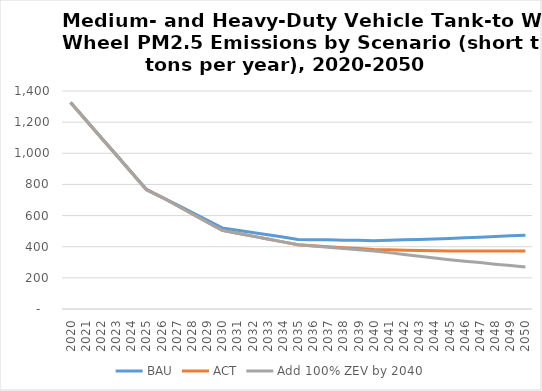
| Category | BAU | ACT | Add 100% ZEV by 2040 |
|---|---|---|---|
| 2020.0 | 1326 | 1326 | 1326.052 |
| 2021.0 | 1215 | 1214 | 1214 |
| 2022.0 | 1103 | 1102 | 1102 |
| 2023.0 | 992 | 990 | 990 |
| 2024.0 | 880 | 878 | 878 |
| 2025.0 | 769 | 766 | 765.915 |
| 2026.0 | 719 | 719 | 719 |
| 2027.0 | 670 | 666 | 665 |
| 2028.0 | 620 | 612 | 612 |
| 2029.0 | 571 | 559 | 558 |
| 2030.0 | 521 | 505 | 504.889 |
| 2031.0 | 506 | 486 | 486 |
| 2032.0 | 491 | 468 | 468 |
| 2033.0 | 477 | 449 | 449 |
| 2034.0 | 462 | 431 | 431 |
| 2035.0 | 447 | 412 | 412.11 |
| 2036.0 | 445 | 406 | 404 |
| 2037.0 | 444 | 400 | 396 |
| 2038.0 | 442 | 394 | 389 |
| 2039.0 | 441 | 388 | 381 |
| 2040.0 | 439 | 382 | 372.81 |
| 2041.0 | 442 | 380 | 362 |
| 2042.0 | 445 | 378 | 350 |
| 2043.0 | 447 | 376 | 339 |
| 2044.0 | 450 | 374 | 328 |
| 2045.0 | 453 | 372 | 316.452 |
| 2046.0 | 457 | 372 | 307 |
| 2047.0 | 461 | 372 | 298 |
| 2048.0 | 466 | 373 | 288 |
| 2049.0 | 470 | 373 | 279 |
| 2050.0 | 474 | 373 | 269.237 |